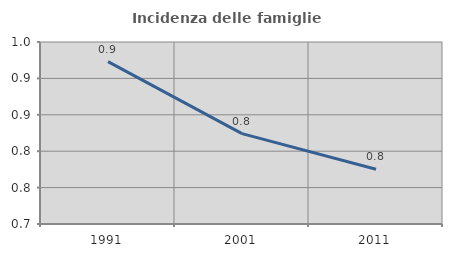
| Category | Incidenza delle famiglie numerose |
|---|---|
| 1991.0 | 0.923 |
| 2001.0 | 0.824 |
| 2011.0 | 0.775 |